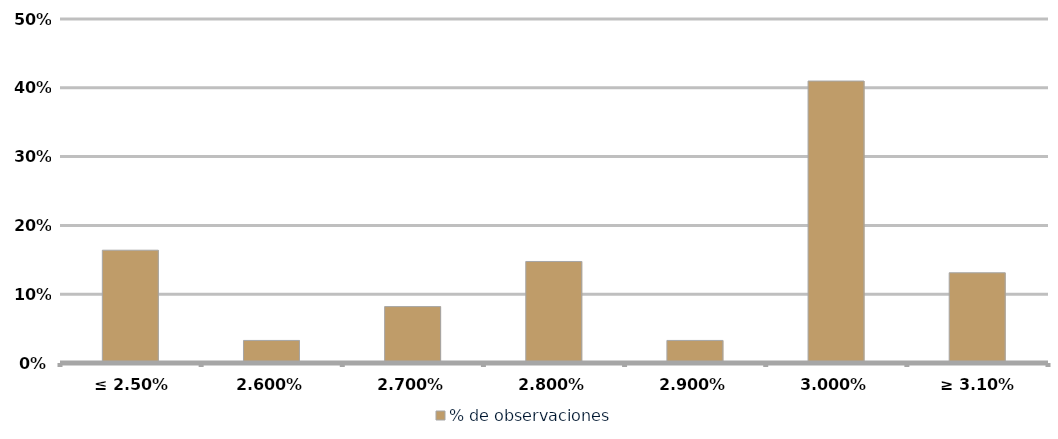
| Category | % de observaciones  |
|---|---|
| ≤ 2.50% | 0.164 |
| 2.60% | 0.033 |
| 2.70% | 0.082 |
| 2.80% | 0.148 |
| 2.90% | 0.033 |
| 3.00% | 0.41 |
| ≥ 3.10% | 0.131 |